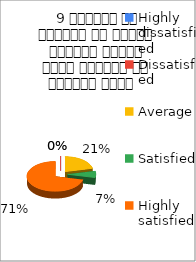
| Category |  9 शिक्षक ने शिक्षण के दौरान आधुनिक तकनीक पावर पॉइन्ट का प्रयोग किया   |
|---|---|
| Highly dissatisfied | 0 |
| Dissatisfied | 0 |
| Average | 3 |
| Satisfied | 1 |
| Highly satisfied | 10 |